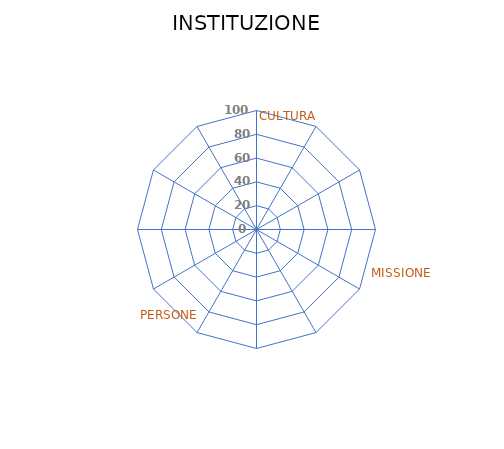
| Category | Series 0 |
|---|---|
| GOVERNANCE | 0 |
| STRATEGIA | 0 |
| CONTESTO INCLUSIVO | 0 |
| MISURAZIONE | 0 |
| CURRICULA | 0 |
| RICERCA | 0 |
| TERZA MISSIONE | 0 |
| FINANZIAMENTO | 0 |
| IDENTIFICAZIONE | 0 |
| CONSULTAZIONE | 0 |
| COINVOLGIMENTO | 0 |
| CO-CREAZIONE | 0 |